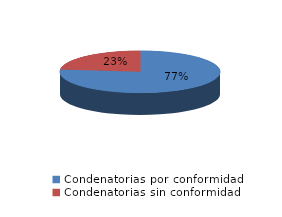
| Category | Series 0 |
|---|---|
| 0 | 56 |
| 1 | 17 |